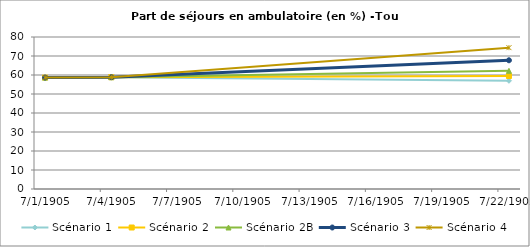
| Category | Scénario 1 | Scénario 2 | Scénario 2B | Scénario 3 | Scénario 4 |
|---|---|---|---|---|---|
| 2009.0 | 58.645 | 58.645 | 58.645 | 58.645 | 58.645 |
| 2012.0 | 58.843 | 58.843 | 58.843 | 58.843 | 58.843 |
| 2030.0 | 56.956 | 59.478 | 62.201 | 67.751 | 74.383 |